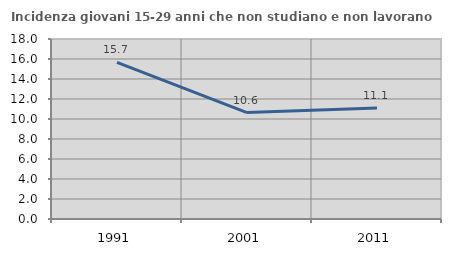
| Category | Incidenza giovani 15-29 anni che non studiano e non lavorano  |
|---|---|
| 1991.0 | 15.672 |
| 2001.0 | 10.638 |
| 2011.0 | 11.111 |